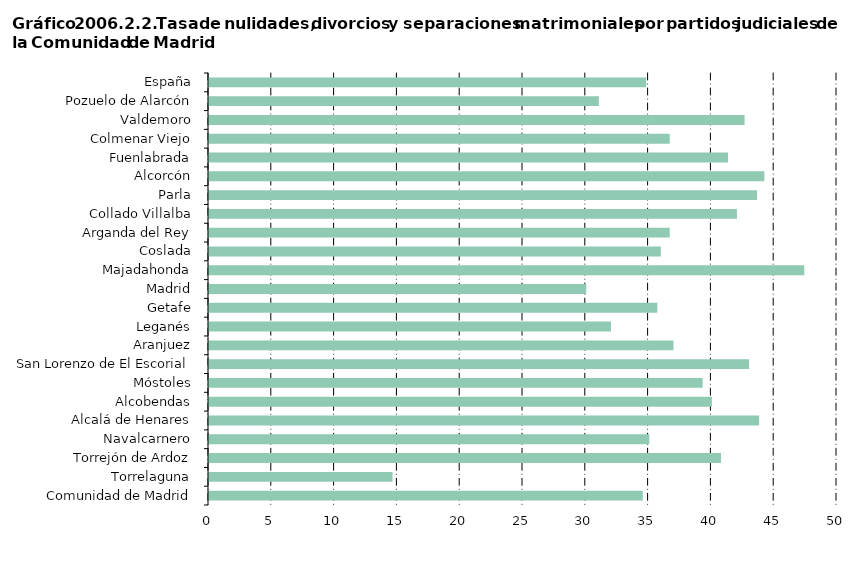
| Category | Series 0 |
|---|---|
| Comunidad de Madrid | 34.538 |
|     Torrelaguna | 14.613 |
|     Torrejón de Ardoz | 40.767 |
|     Navalcarnero | 35.054 |
|     Alcalá de Henares | 43.802 |
|     Alcobendas | 40.039 |
|     Móstoles | 39.299 |
|     San Lorenzo de El Escorial | 42.997 |
|     Aranjuez | 36.982 |
|     Leganés | 32.005 |
|     Getafe | 35.696 |
|     Madrid | 30.036 |
|     Majadahonda | 47.395 |
|     Coslada | 35.97 |
|     Arganda del Rey | 36.682 |
|     Collado Villalba | 42.033 |
|     Parla | 43.637 |
|     Alcorcón | 44.22 |
|     Fuenlabrada | 41.327 |
|     Colmenar Viejo | 36.684 |
|     Valdemoro | 42.646 |
|     Pozuelo de Alarcón | 31.038 |
| España | 34.809 |